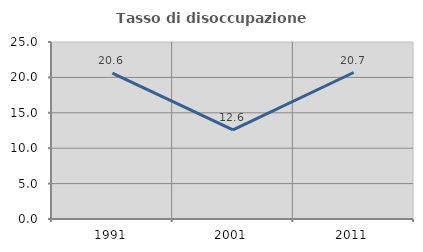
| Category | Tasso di disoccupazione giovanile  |
|---|---|
| 1991.0 | 20.614 |
| 2001.0 | 12.583 |
| 2011.0 | 20.69 |